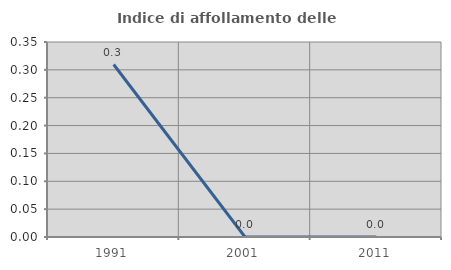
| Category | Indice di affollamento delle abitazioni  |
|---|---|
| 1991.0 | 0.31 |
| 2001.0 | 0 |
| 2011.0 | 0 |